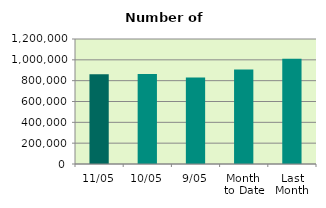
| Category | Series 0 |
|---|---|
| 11/05 | 861506 |
| 10/05 | 864808 |
| 9/05 | 831432 |
| Month 
to Date | 906269.5 |
| Last
Month | 1010681.333 |